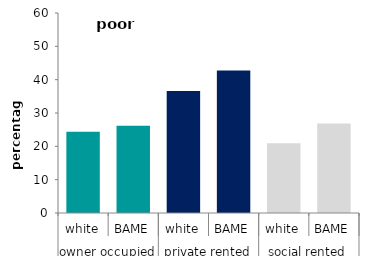
| Category | poor housing |
|---|---|
| 0 | 24.366 |
| 1 | 26.171 |
| 2 | 36.616 |
| 3 | 42.786 |
| 4 | 20.896 |
| 5 | 26.848 |